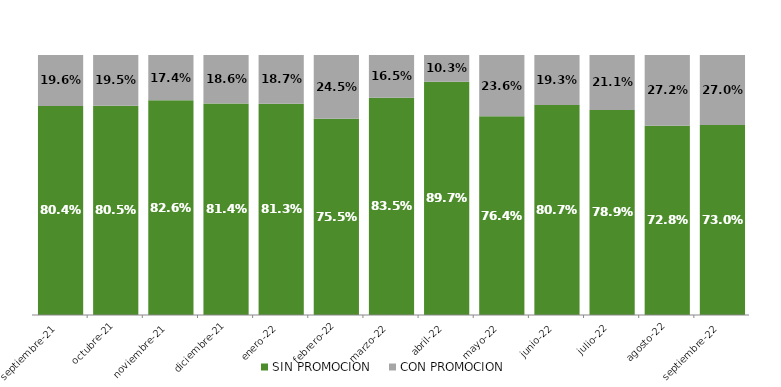
| Category | SIN PROMOCION   | CON PROMOCION   |
|---|---|---|
| 2021-09-01 | 0.804 | 0.196 |
| 2021-10-01 | 0.805 | 0.195 |
| 2021-11-01 | 0.826 | 0.174 |
| 2021-12-01 | 0.814 | 0.186 |
| 2022-01-01 | 0.813 | 0.187 |
| 2022-02-01 | 0.755 | 0.245 |
| 2022-03-01 | 0.835 | 0.165 |
| 2022-04-01 | 0.897 | 0.103 |
| 2022-05-01 | 0.764 | 0.236 |
| 2022-06-01 | 0.807 | 0.193 |
| 2022-07-01 | 0.789 | 0.211 |
| 2022-08-01 | 0.728 | 0.272 |
| 2022-09-01 | 0.73 | 0.27 |